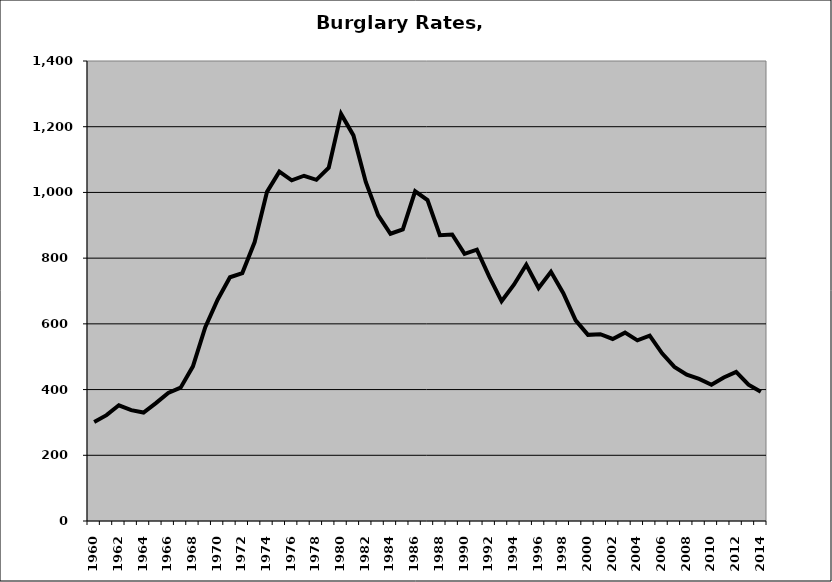
| Category | Burglary |
|---|---|
| 1960.0 | 301.413 |
| 1961.0 | 322.076 |
| 1962.0 | 352.149 |
| 1963.0 | 337.307 |
| 1964.0 | 330.202 |
| 1965.0 | 358.815 |
| 1966.0 | 389.914 |
| 1967.0 | 405.866 |
| 1968.0 | 470.638 |
| 1969.0 | 589.972 |
| 1970.0 | 673.625 |
| 1971.0 | 741.803 |
| 1972.0 | 754.63 |
| 1973.0 | 848.831 |
| 1974.0 | 1001.752 |
| 1975.0 | 1063.049 |
| 1976.0 | 1036.703 |
| 1977.0 | 1050.758 |
| 1978.0 | 1038.383 |
| 1979.0 | 1075.028 |
| 1980.0 | 1238.94 |
| 1981.0 | 1173.618 |
| 1982.0 | 1031.917 |
| 1983.0 | 930.839 |
| 1984.0 | 874.226 |
| 1985.0 | 887.264 |
| 1986.0 | 1003.49 |
| 1987.0 | 976.754 |
| 1988.0 | 869.97 |
| 1989.0 | 872.091 |
| 1990.0 | 813.212 |
| 1991.0 | 825.987 |
| 1992.0 | 743.58 |
| 1993.0 | 668.79 |
| 1994.0 | 719.064 |
| 1995.0 | 779.794 |
| 1996.0 | 709.083 |
| 1997.0 | 758.264 |
| 1998.0 | 693.084 |
| 1999.0 | 610.45 |
| 2000.0 | 566.481 |
| 2001.0 | 568.46 |
| 2002.0 | 554.007 |
| 2003.0 | 573.285 |
| 2004.0 | 549.837 |
| 2005.0 | 564.306 |
| 2006.0 | 510.207 |
| 2007.0 | 468.987 |
| 2008.0 | 445.497 |
| 2009.0 | 432.268 |
| 2010.0 | 414.779 |
| 2011.0 | 436.624 |
| 2012.0 | 453.751 |
| 2013.0 | 414.981 |
| 2014.0 | 393.279 |